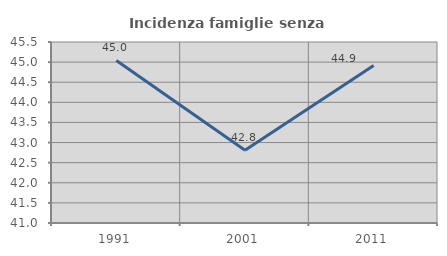
| Category | Incidenza famiglie senza nuclei |
|---|---|
| 1991.0 | 45.041 |
| 2001.0 | 42.807 |
| 2011.0 | 44.918 |